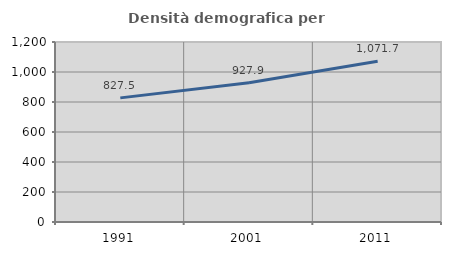
| Category | Densità demografica |
|---|---|
| 1991.0 | 827.508 |
| 2001.0 | 927.932 |
| 2011.0 | 1071.691 |